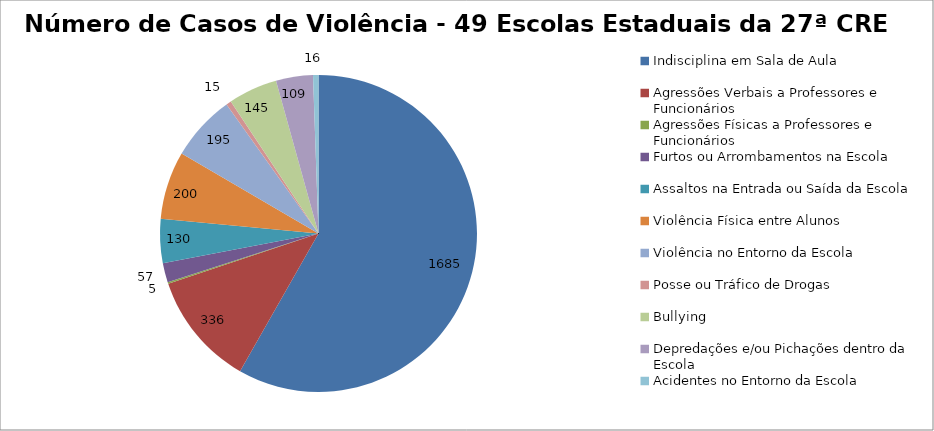
| Category | Número de Casos |
|---|---|
| Indisciplina em Sala de Aula | 1685 |
| Agressões Verbais a Professores e Funcionários | 336 |
| Agressões Físicas a Professores e Funcionários | 5 |
| Furtos ou Arrombamentos na Escola | 57 |
| Assaltos na Entrada ou Saída da Escola | 130 |
| Violência Física entre Alunos | 200 |
| Violência no Entorno da Escola | 195 |
| Posse ou Tráfico de Drogas | 15 |
| Bullying | 145 |
| Depredações e/ou Pichações dentro da Escola | 109 |
| Acidentes no Entorno da Escola | 16 |